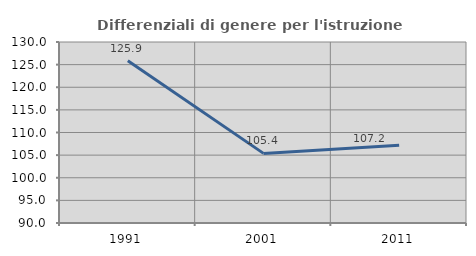
| Category | Differenziali di genere per l'istruzione superiore |
|---|---|
| 1991.0 | 125.852 |
| 2001.0 | 105.386 |
| 2011.0 | 107.18 |